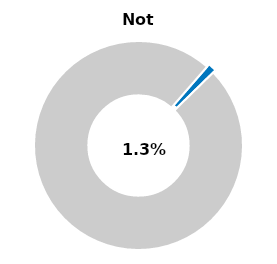
| Category | Series 0 |
|---|---|
| Not passed | 0.013 |
| Other | 0.987 |